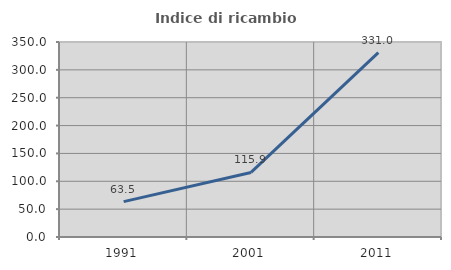
| Category | Indice di ricambio occupazionale  |
|---|---|
| 1991.0 | 63.483 |
| 2001.0 | 115.909 |
| 2011.0 | 330.986 |